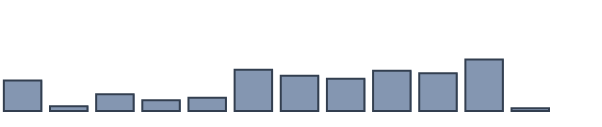
| Category | Series 0 |
|---|---|
| 0 | 9.6 |
| 1 | 1.5 |
| 2 | 5.3 |
| 3 | 3.4 |
| 4 | 4.2 |
| 5 | 13 |
| 6 | 11.1 |
| 7 | 10.2 |
| 8 | 12.7 |
| 9 | 11.9 |
| 10 | 16.2 |
| 11 | 0.9 |
| 12 | 0 |